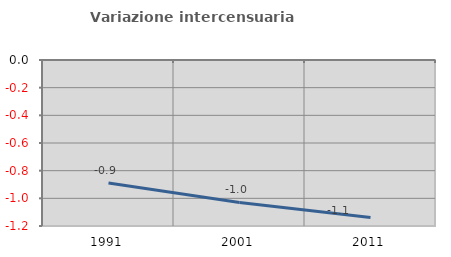
| Category | Variazione intercensuaria annua |
|---|---|
| 1991.0 | -0.889 |
| 2001.0 | -1.03 |
| 2011.0 | -1.138 |